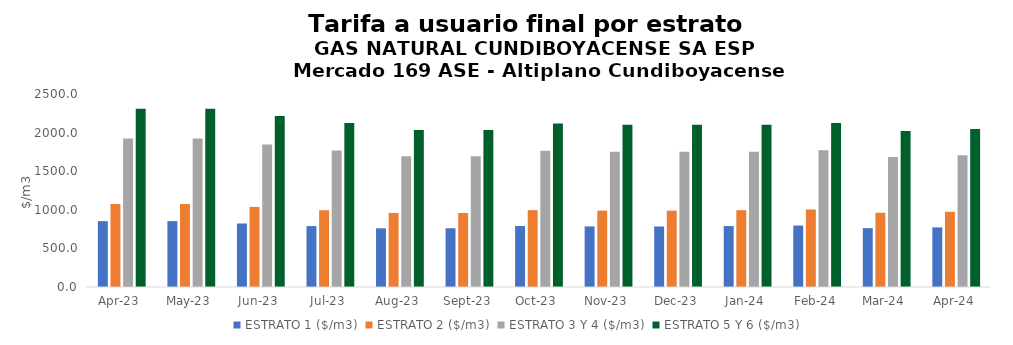
| Category | ESTRATO 1 ($/m3) | ESTRATO 2 ($/m3) | ESTRATO 3 Y 4 ($/m3) | ESTRATO 5 Y 6 ($/m3) |
|---|---|---|---|---|
| 2023-04-01 | 853.19 | 1075.46 | 1923.35 | 2308.02 |
| 2023-05-01 | 853.19 | 1075.46 | 1923.35 | 2308.02 |
| 2023-06-01 | 822.7 | 1037.61 | 1845.24 | 2214.288 |
| 2023-07-01 | 788.93 | 994.99 | 1769.1 | 2122.92 |
| 2023-08-01 | 760.33 | 959.38 | 1694.56 | 2033.472 |
| 2023-09-01 | 760.57 | 958.84 | 1694.55 | 2033.46 |
| 2023-10-01 | 789.68 | 995.66 | 1764.51 | 2117.412 |
| 2023-11-01 | 784.66 | 989.45 | 1750.95 | 2101.14 |
| 2023-12-01 | 783.85 | 988.36 | 1750.95 | 2101.14 |
| 2024-01-01 | 788.85 | 995.5 | 1752.45 | 2102.94 |
| 2024-02-01 | 796.03 | 1003.92 | 1770.22 | 2124.264 |
| 2024-03-01 | 762.25 | 961.87 | 1684.98 | 2021.976 |
| 2024-04-01 | 772.2 | 974.75 | 1706.36 | 2047.632 |